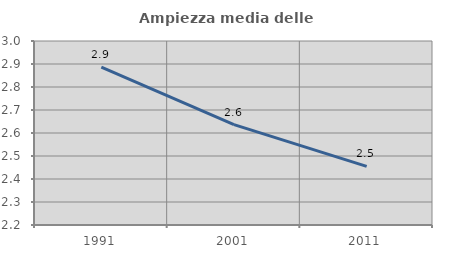
| Category | Ampiezza media delle famiglie |
|---|---|
| 1991.0 | 2.886 |
| 2001.0 | 2.637 |
| 2011.0 | 2.455 |